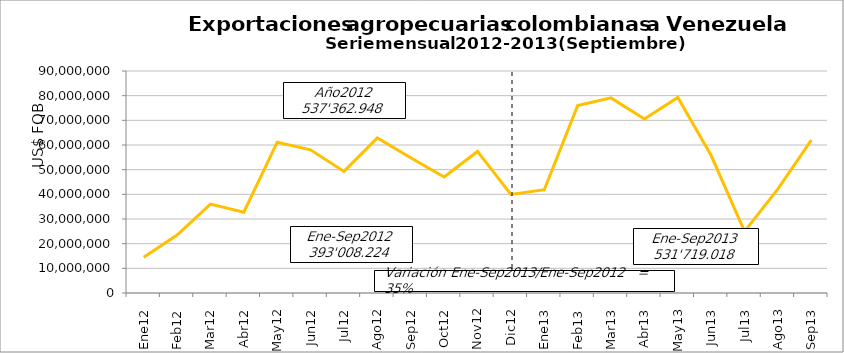
| Category | Series 0 |
|---|---|
| 0 | 14534569.96 |
| 1 | 23496729.4 |
| 2 | 36042539.37 |
| 3 | 32742156.03 |
| 4 | 61124349.48 |
| 5 | 58046659.44 |
| 6 | 49299479.29 |
| 7 | 62892635.11 |
| 8 | 54829105.91 |
| 9 | 47037795.76 |
| 10 | 57390321.53 |
| 11 | 39926606.77 |
| 12 | 41884321.5 |
| 13 | 75954281.07 |
| 14 | 79110359.25 |
| 15 | 70545612.18 |
| 16 | 79301140.98 |
| 17 | 55731995.67 |
| 18 | 25004891.73 |
| 19 | 42211484.92 |
| 20 | 61974930.83 |